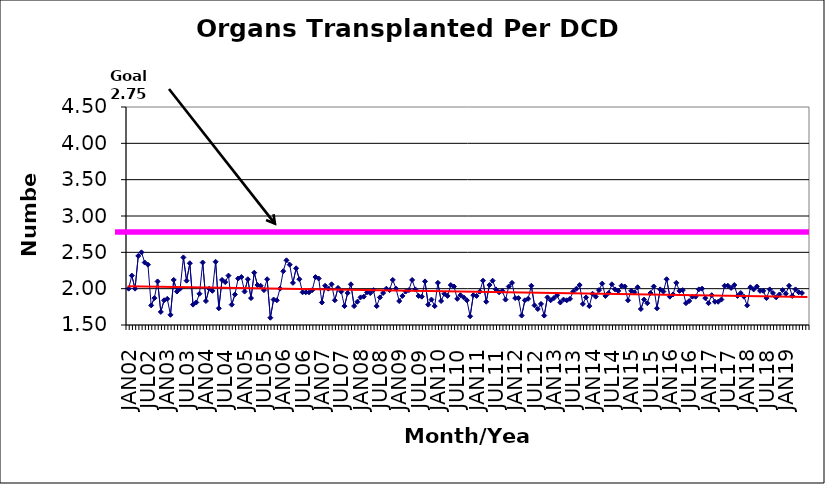
| Category | Series 0 |
|---|---|
| JAN02 | 2 |
| FEB02 | 2.18 |
| MAR02 | 2 |
| APR02 | 2.45 |
| MAY02 | 2.5 |
| JUN02 | 2.36 |
| JUL02 | 2.33 |
| AUG02 | 1.77 |
| SEP02 | 1.87 |
| OCT02 | 2.1 |
| NOV02 | 1.68 |
| DEC02 | 1.84 |
| JAN03 | 1.86 |
| FEB03 | 1.64 |
| MAR03 | 2.12 |
| APR03 | 1.96 |
| MAY03 | 2 |
| JUN03 | 2.43 |
| JUL03 | 2.11 |
| AUG03 | 2.35 |
| SEP03 | 1.78 |
| OCT03 | 1.81 |
| NOV03 | 1.93 |
| DEC03 | 2.36 |
| JAN04 | 1.83 |
| FEB04 | 2 |
| MAR04 | 1.97 |
| APR04 | 2.37 |
| MAY04 | 1.73 |
| JUN04 | 2.12 |
| JUL04 | 2.09 |
| AUG04 | 2.18 |
| SEP04 | 1.78 |
| OCT04 | 1.92 |
| NOV04 | 2.14 |
| DEC04 | 2.16 |
| JAN05 | 1.96 |
| FEB05 | 2.13 |
| MAR05 | 1.87 |
| APR05 | 2.22 |
| MAY05 | 2.05 |
| JUN05 | 2.04 |
| JUL05 | 1.98 |
| AUG05 | 2.13 |
| SEP05 | 1.6 |
| OCT05 | 1.85 |
| NOV05 | 1.84 |
| DEC05 | 2 |
| JAN06 | 2.24 |
| FEB06 | 2.39 |
| MAR06 | 2.33 |
| APR06 | 2.08 |
| MAY06 | 2.28 |
| JUN06 | 2.13 |
| JUL06 | 1.95 |
| AUG06 | 1.95 |
| SEP06 | 1.95 |
| OCT06 | 1.98 |
| NOV06 | 2.16 |
| DEC06 | 2.14 |
| JAN07 | 1.81 |
| FEB07 | 2.04 |
| MAR07 | 2 |
| APR07 | 2.06 |
| MAY07 | 1.84 |
| JUN07 | 2.01 |
| JUL07 | 1.96 |
| AUG07 | 1.76 |
| SEP07 | 1.94 |
| OCT07 | 2.06 |
| NOV07 | 1.76 |
| DEC07 | 1.82 |
| JAN08 | 1.88 |
| FEB08 | 1.89 |
| MAR08 | 1.95 |
| APR08 | 1.94 |
| MAY08 | 1.98 |
| JUN08 | 1.76 |
| JUL08 | 1.88 |
| AUG08 | 1.94 |
| SEP08 | 2 |
| OCT08 | 1.98 |
| NOV08 | 2.12 |
| DEC08 | 2 |
| JAN09 | 1.83 |
| FEB09 | 1.9 |
| MAR09 | 1.96 |
| APR09 | 1.98 |
| MAY09 | 2.12 |
| JUN09 | 1.99 |
| JUL09 | 1.9 |
| AUG09 | 1.89 |
| SEP09 | 2.1 |
| OCT09 | 1.78 |
| NOV09 | 1.85 |
| DEC09 | 1.76 |
| JAN10 | 2.08 |
| FEB10 | 1.83 |
| MAR10 | 1.93 |
| APR10 | 1.9 |
| MAY10 | 2.05 |
| JUN10 | 2.03 |
| JUL10 | 1.86 |
| AUG10 | 1.91 |
| SEP10 | 1.88 |
| OCT10 | 1.84 |
| NOV10 | 1.62 |
| DEC10 | 1.91 |
| JAN11 | 1.9 |
| FEB11 | 1.96 |
| MAR11 | 2.11 |
| APR11 | 1.82 |
| MAY11 | 2.05 |
| JUN11 | 2.11 |
| JUL11 | 1.99 |
| AUG11 | 1.95 |
| SEP11 | 1.97 |
| OCT11 | 1.85 |
| NOV11 | 2.03 |
| DEC11 | 2.08 |
| JAN12 | 1.87 |
| FEB12 | 1.87 |
| MAR12 | 1.63 |
| APR12 | 1.84 |
| MAY12 | 1.86 |
| JUN12 | 2.04 |
| JUL12 | 1.77 |
| AUG12 | 1.72 |
| SEP12 | 1.79 |
| OCT12 | 1.63 |
| NOV12 | 1.88 |
| DEC12 | 1.84 |
| JAN13 | 1.87 |
| FEB13 | 1.91 |
| MAR13 | 1.81 |
| APR13 | 1.85 |
| MAY13 | 1.84 |
| JUN13 | 1.86 |
| JUL13 | 1.96 |
| AUG13 | 2 |
| SEP13 | 2.05 |
| OCT13 | 1.79 |
| NOV13 | 1.88 |
| DEC13 | 1.76 |
| JAN14 | 1.93 |
| FEB14 | 1.89 |
| MAR14 | 1.98 |
| APR14 | 2.07 |
| MAY14 | 1.9 |
| JUN14 | 1.94 |
| JUL14 | 2.06 |
| AUG14 | 1.99 |
| SEP14 | 1.97 |
| OCT14 | 2.04 |
| NOV14 | 2.03 |
| DEC14 | 1.84 |
| JAN15 | 1.97 |
| FEB15 | 1.95 |
| MAR15 | 2.02 |
| APR15 | 1.72 |
| MAY15 | 1.85 |
| JUN15 | 1.8 |
| JUL15 | 1.94 |
| AUG15 | 2.03 |
| SEP15 | 1.73 |
| OCT15 | 1.99 |
| NOV15 | 1.96 |
| DEC15 | 2.13 |
| JAN16 | 1.89 |
| FEB16 | 1.92 |
| MAR16 | 2.08 |
| APR16 | 1.97 |
| MAY16 | 1.98 |
| JUN16 | 1.8 |
| JUL16 | 1.83 |
| AUG16 | 1.89 |
| SEP16 | 1.89 |
| OCT16 | 1.99 |
| NOV16 | 2 |
| DEC16 | 1.87 |
| JAN17 | 1.8 |
| FEB17 | 1.91 |
| MAR17 | 1.82 |
| APR17 | 1.82 |
| MAY17 | 1.85 |
| JUN17 | 2.04 |
| JUL17 | 2.04 |
| AUG17 | 2.01 |
| SEP17 | 2.05 |
| OCT17 | 1.9 |
| NOV17 | 1.94 |
| DEC17 | 1.89 |
| JAN18 | 1.77 |
| FEB18 | 2.02 |
| MAR18 | 1.99 |
| APR18 | 2.03 |
| MAY18 | 1.97 |
| JUN18 | 1.97 |
| JUL18 | 1.87 |
| AUG18 | 1.99 |
| SEP18 | 1.94 |
| OCT18 | 1.88 |
| NOV18 | 1.92 |
| DEC18 | 1.98 |
| JAN19 | 1.93 |
| FEB19 | 2.04 |
| MAR19 | 1.9 |
| APR19 | 1.99 |
| MAY19 | 1.95 |
| JUN19 | 1.94 |